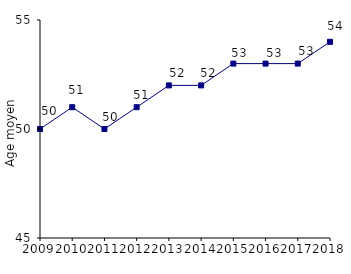
| Category | Series 0 |
|---|---|
| 2009.0 | 50 |
| 2010.0 | 51 |
| 2011.0 | 50 |
| 2012.0 | 51 |
| 2013.0 | 52 |
| 2014.0 | 52 |
| 2015.0 | 53 |
| 2016.0 | 53 |
| 2017.0 | 53 |
| 2018.0 | 54 |